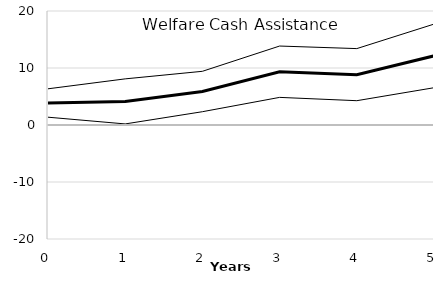
| Category | Series 0 | Series 1 | Series 2 |
|---|---|---|---|
| 0.0 | 3.86 | 6.351 | 1.37 |
| 1.0 | 4.141 | 8.095 | 0.187 |
| 2.0 | 5.876 | 9.42 | 2.333 |
| 3.0 | 9.349 | 13.854 | 4.845 |
| 4.0 | 8.833 | 13.403 | 4.263 |
| 5.0 | 12.119 | 17.701 | 6.538 |